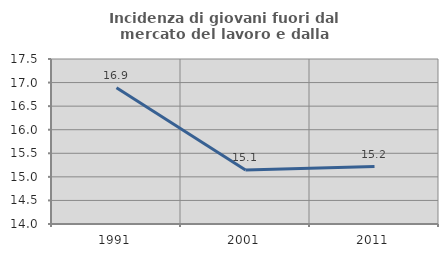
| Category | Incidenza di giovani fuori dal mercato del lavoro e dalla formazione  |
|---|---|
| 1991.0 | 16.892 |
| 2001.0 | 15.144 |
| 2011.0 | 15.217 |